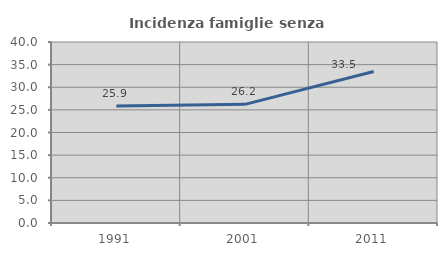
| Category | Incidenza famiglie senza nuclei |
|---|---|
| 1991.0 | 25.881 |
| 2001.0 | 26.222 |
| 2011.0 | 33.472 |